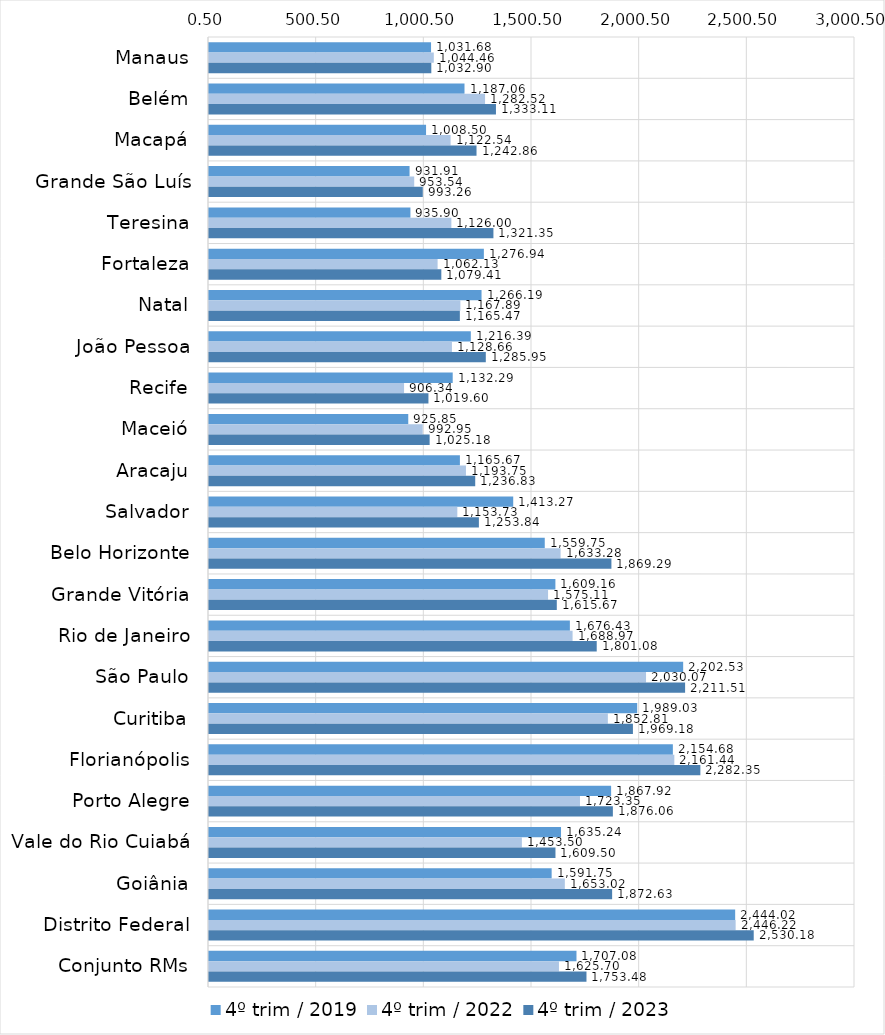
| Category | 4º trim / 2019 | 4º trim / 2022 | 4º trim / 2023 |
|---|---|---|---|
| Manaus | 1031.683 | 1044.461 | 1032.9 |
| Belém | 1187.064 | 1282.517 | 1333.108 |
| Macapá | 1008.497 | 1122.541 | 1242.863 |
| Grande São Luís | 931.908 | 953.545 | 993.256 |
| Teresina | 935.897 | 1126.003 | 1321.348 |
| Fortaleza | 1276.94 | 1062.132 | 1079.412 |
| Natal | 1266.194 | 1167.885 | 1165.471 |
| João Pessoa | 1216.39 | 1128.662 | 1285.945 |
| Recife | 1132.293 | 906.34 | 1019.6 |
| Maceió | 925.851 | 992.948 | 1025.181 |
| Aracaju | 1165.674 | 1193.749 | 1236.832 |
| Salvador | 1413.275 | 1153.733 | 1253.84 |
| Belo Horizonte | 1559.754 | 1633.28 | 1869.288 |
| Grande Vitória | 1609.161 | 1575.111 | 1615.666 |
| Rio de Janeiro | 1676.426 | 1688.966 | 1801.08 |
| São Paulo | 2202.528 | 2030.074 | 2211.507 |
| Curitiba | 1989.026 | 1852.811 | 1969.182 |
| Florianópolis | 2154.678 | 2161.436 | 2282.348 |
| Porto Alegre | 1867.92 | 1723.35 | 1876.057 |
| Vale do Rio Cuiabá | 1635.244 | 1453.496 | 1609.5 |
| Goiânia | 1591.746 | 1653.023 | 1872.627 |
| Distrito Federal | 2444.019 | 2446.222 | 2530.182 |
| Conjunto RMs | 1707.079 | 1625.696 | 1753.475 |